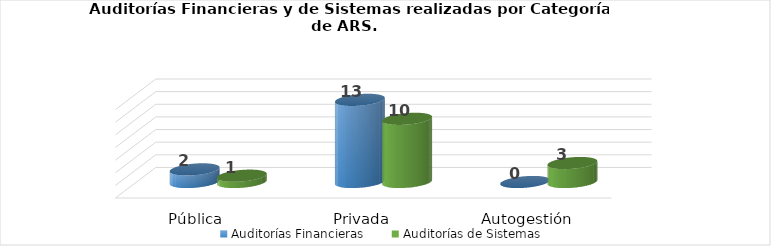
| Category | Auditorías Financieras | Auditorías de Sistemas |
|---|---|---|
| Pública | 2 | 1 |
| Privada | 13 | 10 |
| Autogestión | 0 | 3 |